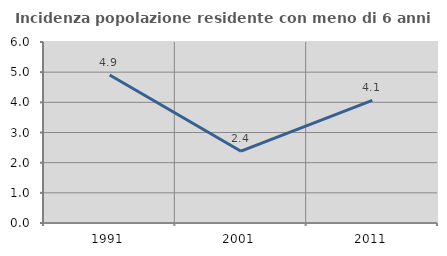
| Category | Incidenza popolazione residente con meno di 6 anni |
|---|---|
| 1991.0 | 4.905 |
| 2001.0 | 2.381 |
| 2011.0 | 4.064 |